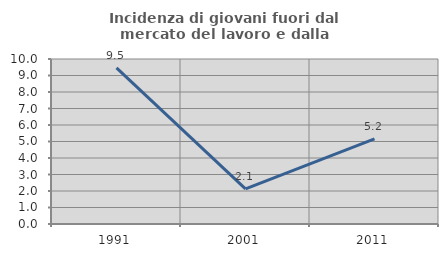
| Category | Incidenza di giovani fuori dal mercato del lavoro e dalla formazione  |
|---|---|
| 1991.0 | 9.459 |
| 2001.0 | 2.128 |
| 2011.0 | 5.155 |